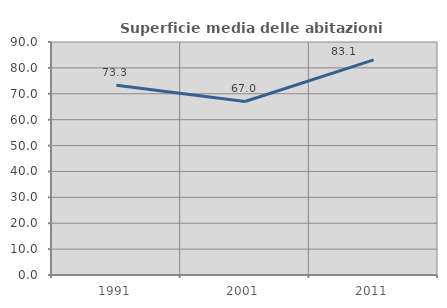
| Category | Superficie media delle abitazioni occupate |
|---|---|
| 1991.0 | 73.321 |
| 2001.0 | 67.019 |
| 2011.0 | 83.093 |